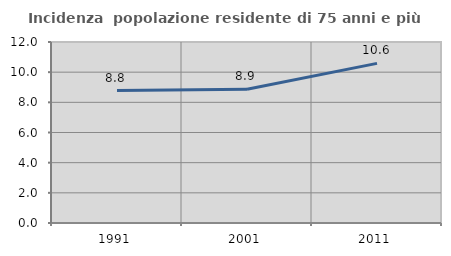
| Category | Incidenza  popolazione residente di 75 anni e più |
|---|---|
| 1991.0 | 8.779 |
| 2001.0 | 8.873 |
| 2011.0 | 10.583 |